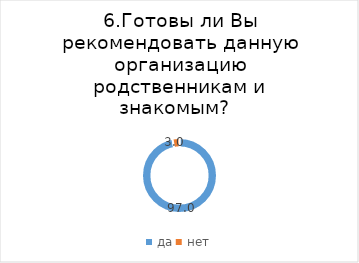
| Category | Series 0 |
|---|---|
| да | 96.958 |
| нет | 3.042 |